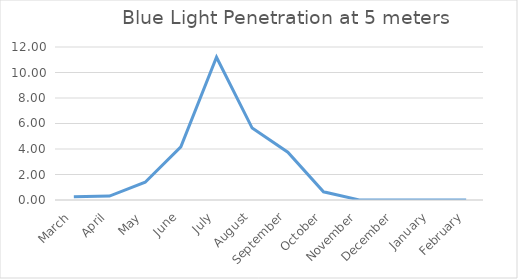
| Category | Light at 5m Below Ice |
|---|---|
| March | 0.249 |
| April | 0.31 |
| May | 1.393 |
| June | 4.174 |
| July | 11.194 |
| August | 5.639 |
| September | 3.753 |
| October | 0.643 |
| November | 0.008 |
| December | 0.007 |
| January | 0.007 |
| February | 0.008 |